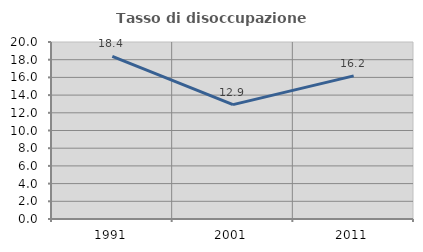
| Category | Tasso di disoccupazione giovanile  |
|---|---|
| 1991.0 | 18.367 |
| 2001.0 | 12.925 |
| 2011.0 | 16.176 |